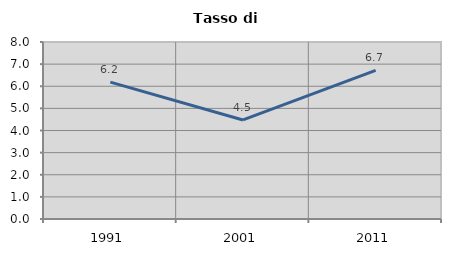
| Category | Tasso di disoccupazione   |
|---|---|
| 1991.0 | 6.189 |
| 2001.0 | 4.478 |
| 2011.0 | 6.721 |